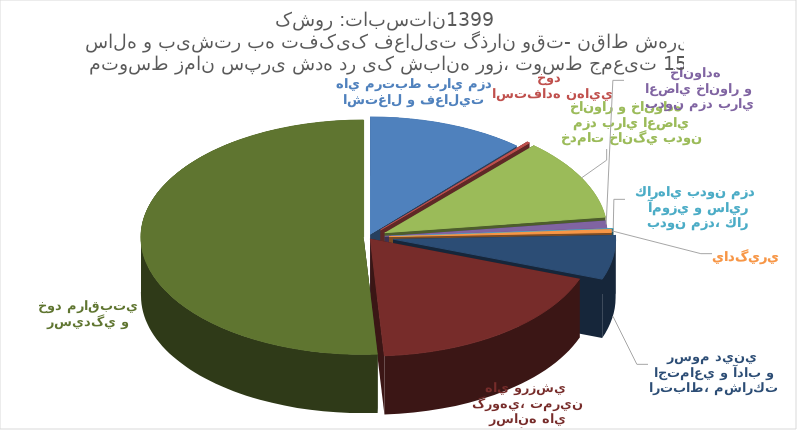
| Category | Series 0 |
|---|---|
| اشتغال و فعاليت هاي مرتبط براي مزد  | 2.56 |
| توليد كالا براي استفاده نهايي خود   | 0.05 |
| خدمات خانگي بدون مزد براي اعضاي خانوار و خانواده   | 2.51 |
| خدمات مراقبتي بدون مزد براي اعضاي خانوار و خانواده   | 0.23 |
| كارداوطلبانه بدون مزد، كار آموزي و ساير كارهاي بدون مزد  | 0.02 |
| يادگيري  | 0.1 |
| معاشرت، ارتباط، مشاركت اجتماعي و آداب و رسوم ديني  | 1.37 |
| فرهنگ، فراغت، رسانه هاي گروهي، تمرين هاي ورزشي  | 4.13 |
| رسيدگي و خود مراقبتي   | 11.42 |